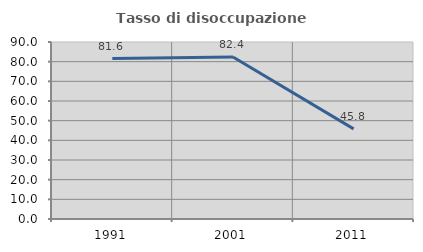
| Category | Tasso di disoccupazione giovanile  |
|---|---|
| 1991.0 | 81.609 |
| 2001.0 | 82.353 |
| 2011.0 | 45.833 |